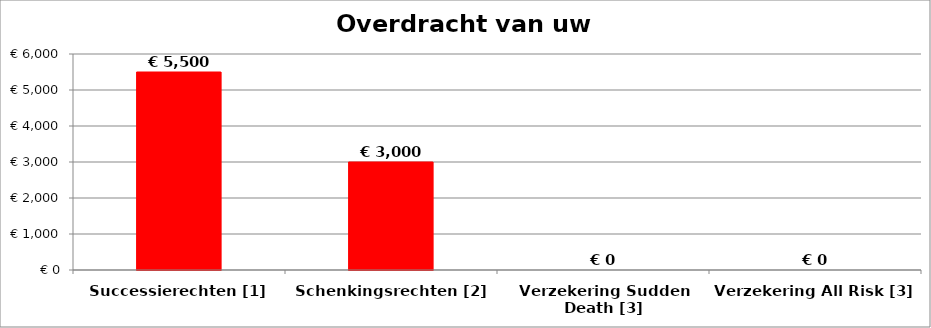
| Category | Series 0 |
|---|---|
| Successierechten [1] | 5500 |
| Schenkingsrechten [2] | 3000 |
| Verzekering Sudden Death [3] | 0 |
| Verzekering All Risk [3] | 0 |